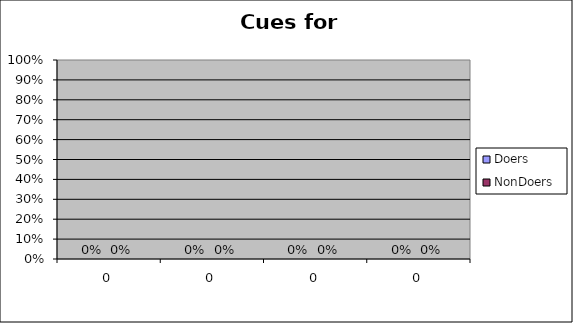
| Category | Doers | NonDoers |
|---|---|---|
| 0.0 | 0 | 0 |
| 0.0 | 0 | 0 |
| 0.0 | 0 | 0 |
| 0.0 | 0 | 0 |